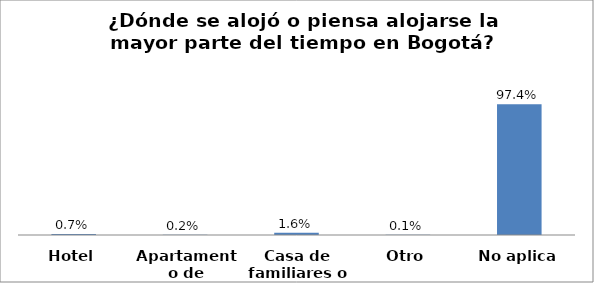
| Category | Series 0 |
|---|---|
| Hotel | 0.007 |
| Apartamento de alquiler | 0.002 |
| Casa de familiares o amigos | 0.016 |
| Otro | 0.001 |
| No aplica | 0.974 |